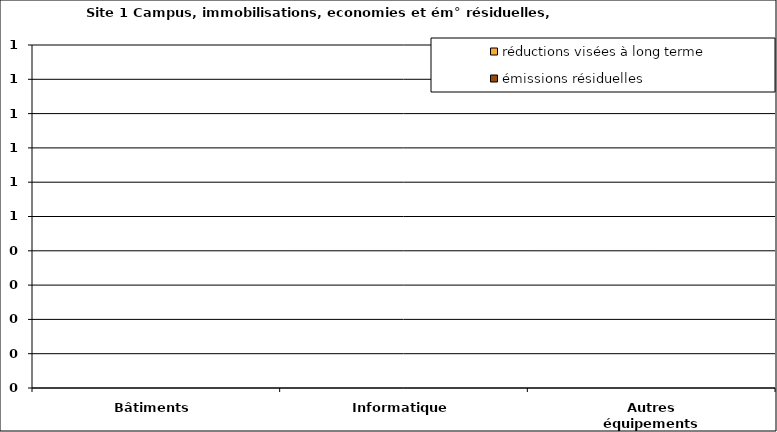
| Category | émissions résiduelles | réductions visées à long terme |
|---|---|---|
| Bâtiments | 0 | 0 |
| Informatique | 0 | 0 |
| Autres équipements | 0 | 0 |